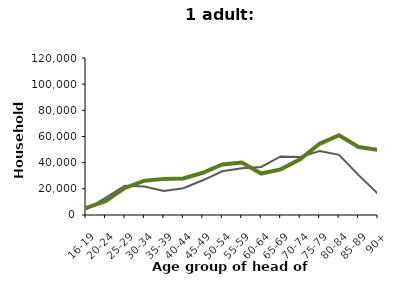
| Category | Series 0 | Series 1 |
|---|---|---|
| 16-19 | 4120 | 5501 |
| 20-24 | 13090 | 10485 |
| 25-29 | 22433 | 20669 |
| 30-34 | 21857 | 26184 |
| 35-39 | 18325 | 27609 |
| 40-44 | 20429 | 27893 |
| 45-49 | 26532 | 32270 |
| 50-54 | 33376 | 38643 |
| 55-59 | 35799 | 40096 |
| 60-64 | 36740 | 31690 |
| 65-69 | 44730 | 34884 |
| 70-74 | 44301 | 42496 |
| 75-79 | 48949 | 54418 |
| 80-84 | 45994 | 60949 |
| 85-89 | 30493 | 51924 |
| 90+ | 16267 | 49765 |